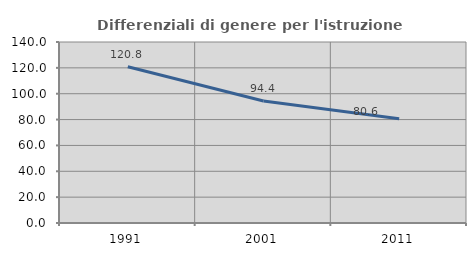
| Category | Differenziali di genere per l'istruzione superiore |
|---|---|
| 1991.0 | 120.821 |
| 2001.0 | 94.421 |
| 2011.0 | 80.592 |